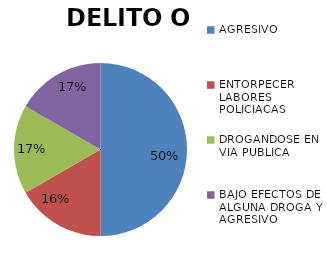
| Category | DELITO O FALTA |
|---|---|
| AGRESIVO | 3 |
| ENTORPECER LABORES POLICIACAS | 1 |
| DROGANDOSE EN VIA PUBLICA | 1 |
| BAJO EFECTOS DE ALGUNA DROGA Y AGRESIVO | 1 |